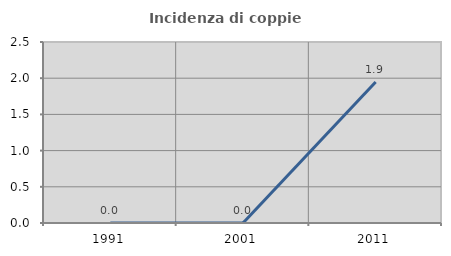
| Category | Incidenza di coppie miste |
|---|---|
| 1991.0 | 0 |
| 2001.0 | 0 |
| 2011.0 | 1.948 |